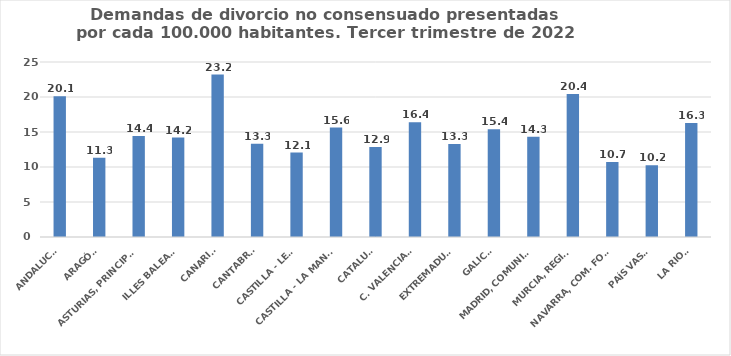
| Category | Series 0 |
|---|---|
| ANDALUCÍA | 20.1 |
| ARAGÓN | 11.318 |
| ASTURIAS, PRINCIPADO | 14.435 |
| ILLES BALEARS | 14.198 |
| CANARIAS | 23.203 |
| CANTABRIA | 13.328 |
| CASTILLA - LEÓN | 12.067 |
| CASTILLA - LA MANCHA | 15.642 |
| CATALUÑA | 12.874 |
| C. VALENCIANA | 16.402 |
| EXTREMADURA | 13.28 |
| GALICIA | 15.395 |
| MADRID, COMUNIDAD | 14.338 |
| MURCIA, REGIÓN | 20.438 |
| NAVARRA, COM. FORAL | 10.699 |
| PAÍS VASCO | 10.239 |
| LA RIOJA | 16.276 |